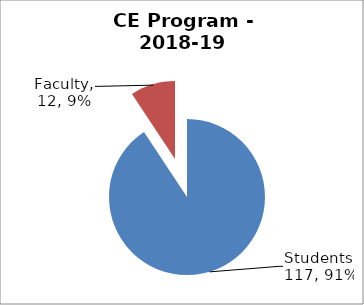
| Category | Series 0 |
|---|---|
| Students | 117 |
| Faculty | 12 |